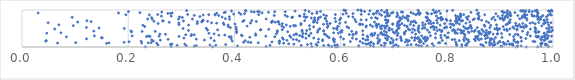
| Category | Series 0 |
|---|---|
| 0.949736153273273 | 0.001 |
| 0.9313688647821662 | 0.002 |
| 0.9712705436193924 | 0.003 |
| 0.3588209849443694 | 0.004 |
| 0.23239114258448637 | 0.005 |
| 0.6979563549919789 | 0.006 |
| 0.5908845298088734 | 0.007 |
| 0.5944280000425406 | 0.008 |
| 0.5458158395788048 | 0.009 |
| 0.9914450610635839 | 0.01 |
| 0.5836586960909029 | 0.011 |
| 0.45986314800716355 | 0.012 |
| 0.8279800813658241 | 0.013 |
| 0.2810581044408342 | 0.014 |
| 0.9037495786408707 | 0.015 |
| 0.6621071880290952 | 0.016 |
| 0.9017380704320929 | 0.017 |
| 0.9771379449883671 | 0.018 |
| 0.3244766761777045 | 0.019 |
| 0.7085061971466029 | 0.02 |
| 0.8693611338816062 | 0.021 |
| 0.6823229191553621 | 0.022 |
| 0.6343750244117963 | 0.023 |
| 0.752289813761984 | 0.024 |
| 0.5785647612633386 | 0.025 |
| 0.9333479806501159 | 0.026 |
| 0.40575277696712936 | 0.027 |
| 0.940079056336971 | 0.028 |
| 0.8866730989315225 | 0.029 |
| 0.6340983724571785 | 0.03 |
| 0.7629999644028119 | 0.031 |
| 0.7754784490591137 | 0.032 |
| 0.30938181607100584 | 0.033 |
| 0.8186320681349829 | 0.034 |
| 0.7473101029380873 | 0.035 |
| 0.656359696268609 | 0.036 |
| 0.32820519175504337 | 0.037 |
| 0.5683514183204914 | 0.038 |
| 0.7008387337262965 | 0.039 |
| 0.9247577547591842 | 0.04 |
| 0.5258753877711302 | 0.041 |
| 0.29210101245507425 | 0.042 |
| 0.4670330751344066 | 0.043 |
| 0.5555771647170828 | 0.044 |
| 0.8352700283421595 | 0.045 |
| 0.3649902197521072 | 0.046 |
| 0.6765020242880322 | 0.047 |
| 0.8371543506026319 | 0.048 |
| 0.8676884753774652 | 0.049 |
| 0.8885929144082504 | 0.05 |
| 0.5890490044521343 | 0.051 |
| 0.7259317878775712 | 0.052 |
| 0.5768857440754621 | 0.053 |
| 0.3539496398170522 | 0.054 |
| 0.8807512328298293 | 0.055 |
| 0.25612301864052595 | 0.056 |
| 0.9866158487966449 | 0.057 |
| 0.5939927365505132 | 0.058 |
| 0.7045521284816405 | 0.059 |
| 0.8281863738406184 | 0.06 |
| 0.9884989083171684 | 0.061 |
| 0.7423195374712963 | 0.062 |
| 0.6066458847214843 | 0.063 |
| 0.985812361390773 | 0.064 |
| 0.7327842786760105 | 0.065 |
| 0.5374900326658978 | 0.066 |
| 0.8639613701213325 | 0.067 |
| 0.3835848848063844 | 0.068 |
| 0.27951007807849054 | 0.069 |
| 0.8907281762333378 | 0.07 |
| 0.5538053393458792 | 0.071 |
| 0.917766506147673 | 0.072 |
| 0.9081760411610182 | 0.073 |
| 0.9219061372387005 | 0.074 |
| 0.8182794049310603 | 0.075 |
| 0.9118612669554279 | 0.076 |
| 0.5119764629002982 | 0.077 |
| 0.6501875104317437 | 0.078 |
| 0.3065782841964467 | 0.079 |
| 0.9239991143705089 | 0.08 |
| 0.9858427922235016 | 0.081 |
| 0.2822638099612795 | 0.082 |
| 0.6471207016883264 | 0.083 |
| 0.9190803499635846 | 0.084 |
| 0.66217789097223 | 0.085 |
| 0.5022041187656148 | 0.086 |
| 0.978468038221844 | 0.087 |
| 0.9768880618369399 | 0.088 |
| 0.5443231729552279 | 0.089 |
| 0.8848357560624478 | 0.09 |
| 0.772648782295962 | 0.091 |
| 0.6529821678158689 | 0.092 |
| 0.7976873493404779 | 0.093 |
| 0.7562446340762456 | 0.094 |
| 0.8383359343945119 | 0.095 |
| 0.9790123553002534 | 0.096 |
| 0.6845499453281203 | 0.097 |
| 0.1592231776711994 | 0.098 |
| 0.4848225671303291 | 0.099 |
| 0.6940567111540826 | 0.1 |
| 0.6700585967752053 | 0.101 |
| 0.682472685370516 | 0.102 |
| 0.49280154317735464 | 0.103 |
| 0.2536605195349129 | 0.104 |
| 0.8959998863830493 | 0.105 |
| 0.06695026888741842 | 0.106 |
| 0.22541302471217015 | 0.107 |
| 0.6417827139325417 | 0.108 |
| 0.9075689156809466 | 0.109 |
| 0.1636699229877255 | 0.11 |
| 0.7843776568012912 | 0.111 |
| 0.2375682598214314 | 0.112 |
| 0.9790495846816536 | 0.113 |
| 0.7867514310627184 | 0.114 |
| 0.4449310327876867 | 0.115 |
| 0.1012494146946395 | 0.116 |
| 0.24304977706323852 | 0.117 |
| 0.698302402181708 | 0.118 |
| 0.8802648275275994 | 0.119 |
| 0.9339849448006651 | 0.12 |
| 0.6562904279233956 | 0.121 |
| 0.4308411027652936 | 0.122 |
| 0.8738112972236661 | 0.123 |
| 0.7492831274123413 | 0.124 |
| 0.9062500026478404 | 0.125 |
| 0.19227697223732898 | 0.126 |
| 0.4172123249903969 | 0.127 |
| 0.9303400080414778 | 0.128 |
| 0.5577671635421152 | 0.129 |
| 0.8170494096755716 | 0.13 |
| 0.693753429745958 | 0.131 |
| 0.6577400059185562 | 0.132 |
| 0.4259444125202323 | 0.133 |
| 0.7216345568415801 | 0.134 |
| 0.5881933117077223 | 0.135 |
| 0.47071387933759407 | 0.136 |
| 0.8891983641320135 | 0.137 |
| 0.4843801109313892 | 0.138 |
| 0.672656058044507 | 0.139 |
| 0.9931026033241311 | 0.14 |
| 0.9334809937811736 | 0.141 |
| 0.20164617368321297 | 0.142 |
| 0.9000709987141736 | 0.143 |
| 0.9964849789441529 | 0.144 |
| 0.9658846879616302 | 0.145 |
| 0.8414901886177256 | 0.146 |
| 0.7268266202967334 | 0.147 |
| 0.6183668833177588 | 0.148 |
| 0.8993382788033822 | 0.149 |
| 0.6367539748515755 | 0.15 |
| 0.7516704542912436 | 0.151 |
| 0.9625233139497282 | 0.152 |
| 0.7479275214209876 | 0.153 |
| 0.915080031113293 | 0.154 |
| 0.22439569516465133 | 0.155 |
| 0.671142814637147 | 0.156 |
| 0.04474872431893427 | 0.157 |
| 0.940658684181506 | 0.158 |
| 0.24732758754629144 | 0.159 |
| 0.5218704800515306 | 0.16 |
| 0.3957906665276495 | 0.161 |
| 0.7602793425844558 | 0.162 |
| 0.8325978030409099 | 0.163 |
| 0.7598916547923797 | 0.164 |
| 0.7262602191975286 | 0.165 |
| 0.9263388202413942 | 0.166 |
| 0.48492543060013116 | 0.167 |
| 0.566236404878688 | 0.168 |
| 0.362159680913203 | 0.169 |
| 0.8819751099500956 | 0.17 |
| 0.4203122915348323 | 0.171 |
| 0.8538705820471038 | 0.172 |
| 0.04580103916682697 | 0.173 |
| 0.8235774408552178 | 0.174 |
| 0.7293688789007248 | 0.175 |
| 0.7144991605334121 | 0.176 |
| 0.7619010518990641 | 0.177 |
| 0.7914546290325968 | 0.178 |
| 0.7392585922854943 | 0.179 |
| 0.9831142649556573 | 0.18 |
| 0.498921338557431 | 0.181 |
| 0.699299244718949 | 0.182 |
| 0.7145820941070058 | 0.183 |
| 0.5867752319422623 | 0.184 |
| 0.2604842460809257 | 0.185 |
| 0.9849465291573857 | 0.186 |
| 0.6877905030072319 | 0.187 |
| 0.6473598874199733 | 0.188 |
| 0.34344898781602357 | 0.189 |
| 0.8607134893742396 | 0.19 |
| 0.8403673958814535 | 0.191 |
| 0.2442703678978854 | 0.192 |
| 0.6739722172991793 | 0.193 |
| 0.6514945642822935 | 0.194 |
| 0.5661974342023492 | 0.195 |
| 0.8886448175709949 | 0.196 |
| 0.7238777756649618 | 0.197 |
| 0.5170517334991199 | 0.198 |
| 0.5885266904468249 | 0.199 |
| 0.8102429765994911 | 0.2 |
| 0.7493686694638569 | 0.201 |
| 0.8317957142063499 | 0.202 |
| 0.8148552710021086 | 0.203 |
| 0.7055253077380912 | 0.204 |
| 0.9774397966361902 | 0.205 |
| 0.5106687529577528 | 0.206 |
| 0.27509605050119956 | 0.207 |
| 0.9267762545639725 | 0.208 |
| 0.49223632412893875 | 0.209 |
| 0.9783915834310928 | 0.21 |
| 0.8518501536317649 | 0.211 |
| 0.5584022505318609 | 0.212 |
| 0.3280564668490849 | 0.213 |
| 0.6297393290116114 | 0.214 |
| 0.8649891929577345 | 0.215 |
| 0.8372200613180846 | 0.216 |
| 0.6054705519399176 | 0.217 |
| 0.7578936047005799 | 0.218 |
| 0.6880390897672266 | 0.219 |
| 0.9769423878207975 | 0.22 |
| 0.12159712427574396 | 0.221 |
| 0.8818163389694909 | 0.222 |
| 0.8845822753485124 | 0.223 |
| 0.5861959774365494 | 0.224 |
| 0.6422146295399044 | 0.225 |
| 0.8729079188647741 | 0.226 |
| 0.3939630254656727 | 0.227 |
| 0.8586083559122829 | 0.228 |
| 0.74457945777082 | 0.229 |
| 0.7640960939778023 | 0.23 |
| 0.9487389284740991 | 0.231 |
| 0.9901857590406791 | 0.232 |
| 0.695789214664223 | 0.233 |
| 0.987231593819244 | 0.234 |
| 0.7135097590127075 | 0.235 |
| 0.756119205114753 | 0.236 |
| 0.669584421678318 | 0.237 |
| 0.5347133223116146 | 0.238 |
| 0.6222522960840166 | 0.239 |
| 0.684758603349414 | 0.24 |
| 0.30487932013933405 | 0.241 |
| 0.7410954249087052 | 0.242 |
| 0.549427497078257 | 0.243 |
| 0.3555727832171321 | 0.244 |
| 0.8554373569205245 | 0.245 |
| 0.7787926522057627 | 0.246 |
| 0.4903398395231873 | 0.247 |
| 0.15105213428753778 | 0.248 |
| 0.1498193826702934 | 0.249 |
| 0.7397201835165316 | 0.25 |
| 0.7892423911970925 | 0.251 |
| 0.7629587723561766 | 0.252 |
| 0.734015665112782 | 0.253 |
| 0.578399111266711 | 0.254 |
| 0.8000271531865475 | 0.255 |
| 0.8918781919148691 | 0.256 |
| 0.9395453298373049 | 0.257 |
| 0.8770119592824627 | 0.258 |
| 0.9038768602714761 | 0.259 |
| 0.8024695519701306 | 0.26 |
| 0.9395621959039823 | 0.261 |
| 0.7464734636517886 | 0.262 |
| 0.42900746480915536 | 0.263 |
| 0.9703708398207787 | 0.264 |
| 0.5060809500440735 | 0.265 |
| 0.6512225830611781 | 0.266 |
| 0.6001917859001028 | 0.267 |
| 0.8334444775341475 | 0.268 |
| 0.9845340853202271 | 0.269 |
| 0.7590653274319367 | 0.27 |
| 0.5287166458748227 | 0.271 |
| 0.7130276949989909 | 0.272 |
| 0.6903313416420871 | 0.273 |
| 0.08380760933258947 | 0.274 |
| 0.98349018359313 | 0.275 |
| 0.3902278814380645 | 0.276 |
| 0.3939598648799294 | 0.277 |
| 0.47607237178507206 | 0.278 |
| 0.9791313269609966 | 0.279 |
| 0.9832362532175686 | 0.28 |
| 0.23440012484631564 | 0.281 |
| 0.9728415241297717 | 0.282 |
| 0.9257016144196557 | 0.283 |
| 0.9718781961729461 | 0.284 |
| 0.8544060633845529 | 0.285 |
| 0.24119326644251804 | 0.286 |
| 0.5751765981438353 | 0.287 |
| 0.29577518146172116 | 0.288 |
| 0.8585312801554182 | 0.289 |
| 0.258215693222239 | 0.29 |
| 0.4592113471919155 | 0.291 |
| 0.9972517624711268 | 0.292 |
| 0.9678350641466538 | 0.293 |
| 0.5270839692934521 | 0.294 |
| 0.6501481401492059 | 0.295 |
| 0.23754934097980474 | 0.296 |
| 0.9573410623982214 | 0.297 |
| 0.5406662779008898 | 0.298 |
| 0.20742395201355068 | 0.299 |
| 0.9911479767731145 | 0.3 |
| 0.13637682292092432 | 0.301 |
| 0.7525773753590337 | 0.302 |
| 0.7691157575700802 | 0.303 |
| 0.5042887681416929 | 0.304 |
| 0.4145283503692526 | 0.305 |
| 0.31858928353055815 | 0.306 |
| 0.6597560397441731 | 0.307 |
| 0.8714120958918081 | 0.308 |
| 0.5404021488379139 | 0.309 |
| 0.522727273362455 | 0.31 |
| 0.7067349363233189 | 0.311 |
| 0.7960652125088354 | 0.312 |
| 0.6872186241805361 | 0.313 |
| 0.7885887919519117 | 0.314 |
| 0.6707132771678361 | 0.315 |
| 0.8723939037135764 | 0.316 |
| 0.4401071981937938 | 0.317 |
| 0.37090632620111724 | 0.318 |
| 0.41322379821648675 | 0.319 |
| 0.6230483945171781 | 0.32 |
| 0.9344081566586451 | 0.321 |
| 0.3818020453494264 | 0.322 |
| 0.8752619083720993 | 0.323 |
| 0.683333730246154 | 0.324 |
| 0.9876437178734299 | 0.325 |
| 0.6629286389877335 | 0.326 |
| 0.5122272493898425 | 0.327 |
| 0.6569961262487748 | 0.328 |
| 0.32429644221373316 | 0.329 |
| 0.5719002165438201 | 0.33 |
| 0.6420873276816561 | 0.331 |
| 0.30827371719595376 | 0.332 |
| 0.8342930255895888 | 0.333 |
| 0.31926146158748536 | 0.334 |
| 0.6790029973741445 | 0.335 |
| 0.9514776950190215 | 0.336 |
| 0.6164841685664055 | 0.337 |
| 0.9184744335736394 | 0.338 |
| 0.6816237691898679 | 0.339 |
| 0.5167970817778663 | 0.34 |
| 0.9334603663015866 | 0.341 |
| 0.6235165288404018 | 0.342 |
| 0.27018231752232086 | 0.343 |
| 0.9290673665769381 | 0.344 |
| 0.865385326733688 | 0.345 |
| 0.7411691219412792 | 0.346 |
| 0.8951106404603054 | 0.347 |
| 0.8874266580118054 | 0.348 |
| 0.25967256228372576 | 0.349 |
| 0.5693292066929116 | 0.35 |
| 0.7203630369168126 | 0.351 |
| 0.43990069952642613 | 0.352 |
| 0.8324043791506209 | 0.353 |
| 0.8615700006073396 | 0.354 |
| 0.36183131537204966 | 0.355 |
| 0.8791095119764558 | 0.356 |
| 0.47913020695763103 | 0.357 |
| 0.5161707847233024 | 0.358 |
| 0.6288384584422986 | 0.359 |
| 0.5347609227072416 | 0.36 |
| 0.6585943770651436 | 0.361 |
| 0.7788679316274892 | 0.362 |
| 0.5291328818887975 | 0.363 |
| 0.9029908977691488 | 0.364 |
| 0.8955953691583228 | 0.365 |
| 0.708241123188961 | 0.366 |
| 0.9837811052459587 | 0.367 |
| 0.6754252775363595 | 0.368 |
| 0.35195414399547165 | 0.369 |
| 0.9833251138143538 | 0.37 |
| 0.819553066608549 | 0.371 |
| 0.5441118226862806 | 0.372 |
| 0.046719010376525885 | 0.373 |
| 0.5956237487214753 | 0.374 |
| 0.7021819995326729 | 0.375 |
| 0.6645852374154868 | 0.376 |
| 0.8620328189342263 | 0.377 |
| 0.873177722447321 | 0.378 |
| 0.8265228635345201 | 0.379 |
| 0.8163281642995432 | 0.38 |
| 0.8154538468694112 | 0.381 |
| 0.8028655885818576 | 0.382 |
| 0.07327926683581049 | 0.383 |
| 0.5868993373422553 | 0.384 |
| 0.7196761037717094 | 0.385 |
| 0.9676240103140007 | 0.386 |
| 0.4040732522912125 | 0.387 |
| 0.841836675337895 | 0.388 |
| 0.8795174869727564 | 0.389 |
| 0.8292642761254063 | 0.39 |
| 0.6767482763596528 | 0.391 |
| 0.9526086815301121 | 0.392 |
| 0.8807040076898388 | 0.393 |
| 0.8781903514696698 | 0.394 |
| 0.7348192310425262 | 0.395 |
| 0.7670204096352549 | 0.396 |
| 0.6862182296209829 | 0.397 |
| 0.7479854895234903 | 0.398 |
| 0.6297294148410298 | 0.399 |
| 0.9724881673305967 | 0.4 |
| 0.6019738159910182 | 0.401 |
| 0.5564811374923992 | 0.402 |
| 0.9896217750007635 | 0.403 |
| 0.8816675701480112 | 0.404 |
| 0.6990959026925694 | 0.405 |
| 0.8403372670366838 | 0.406 |
| 0.5998999803159059 | 0.407 |
| 0.9923515071693668 | 0.408 |
| 0.48094811634544554 | 0.409 |
| 0.20630684779993885 | 0.41 |
| 0.8596195908112508 | 0.411 |
| 0.5003086331362187 | 0.412 |
| 0.9963142755271943 | 0.413 |
| 0.790044012505673 | 0.414 |
| 0.9730712661112635 | 0.415 |
| 0.8689348709326415 | 0.416 |
| 0.9911380911270377 | 0.417 |
| 0.7051960337436747 | 0.418 |
| 0.851811795485328 | 0.419 |
| 0.22619858735972484 | 0.42 |
| 0.5274921248186157 | 0.421 |
| 0.25082556056095906 | 0.422 |
| 0.8606461950370319 | 0.423 |
| 0.9662056244671069 | 0.424 |
| 0.6209403652637582 | 0.425 |
| 0.7226592230583945 | 0.426 |
| 0.4041778064344766 | 0.427 |
| 0.9425620904135059 | 0.428 |
| 0.847088454963712 | 0.429 |
| 0.13525030396704982 | 0.43 |
| 0.6823275120664627 | 0.431 |
| 0.8282897136893496 | 0.432 |
| 0.816002163124775 | 0.433 |
| 0.5680027899301079 | 0.434 |
| 0.20507707814044018 | 0.435 |
| 0.8319818241225692 | 0.436 |
| 0.6416428946154127 | 0.437 |
| 0.48066203337171 | 0.438 |
| 0.9136666467729392 | 0.439 |
| 0.5683060236917177 | 0.44 |
| 0.781767862913001 | 0.441 |
| 0.5360599949016707 | 0.442 |
| 0.7054668058654607 | 0.443 |
| 0.7909900927217042 | 0.444 |
| 0.8107609178984982 | 0.445 |
| 0.6028259139735676 | 0.446 |
| 0.7459325812878126 | 0.447 |
| 0.3135687990945447 | 0.448 |
| 0.8744851795916995 | 0.449 |
| 0.6913986402848691 | 0.45 |
| 0.9991544956520481 | 0.451 |
| 0.7396732091341026 | 0.452 |
| 0.5274929912824536 | 0.453 |
| 0.8957955834619686 | 0.454 |
| 0.8534982129520801 | 0.455 |
| 0.5576227335413411 | 0.456 |
| 0.3493510658598865 | 0.457 |
| 0.8257632390895437 | 0.458 |
| 0.7634205760351626 | 0.459 |
| 0.9319339554313751 | 0.46 |
| 0.8128958055122034 | 0.461 |
| 0.4488938431453584 | 0.462 |
| 0.36840866061240074 | 0.463 |
| 0.7862889291045403 | 0.464 |
| 0.7303875907417288 | 0.465 |
| 0.4499218020994862 | 0.466 |
| 0.9083613303640506 | 0.467 |
| 0.4900312251109884 | 0.468 |
| 0.6912866421488981 | 0.469 |
| 0.8127231130173086 | 0.47 |
| 0.9677024689777338 | 0.471 |
| 0.8661077838578768 | 0.472 |
| 0.7758860987404084 | 0.473 |
| 0.9128760510274648 | 0.474 |
| 0.5935582688226549 | 0.475 |
| 0.6967528048711696 | 0.476 |
| 0.8212093310868145 | 0.477 |
| 0.4645814387157979 | 0.478 |
| 0.7278796217964013 | 0.479 |
| 0.9326723956148432 | 0.48 |
| 0.9928368192178487 | 0.481 |
| 0.5418924355252774 | 0.482 |
| 0.9573648493605393 | 0.483 |
| 0.06160073620787866 | 0.484 |
| 0.4034921457661796 | 0.485 |
| 0.8903068258333888 | 0.486 |
| 0.8956565171683911 | 0.487 |
| 0.7360060277797151 | 0.488 |
| 0.6761880129384821 | 0.489 |
| 0.918805697302855 | 0.49 |
| 0.8996419063600115 | 0.491 |
| 0.8949491935863755 | 0.492 |
| 0.5607390187268749 | 0.493 |
| 0.8374791575221667 | 0.494 |
| 0.7081272972422863 | 0.495 |
| 0.6765586048792585 | 0.496 |
| 0.7463963576505698 | 0.497 |
| 0.753954444260029 | 0.498 |
| 0.30333567320229404 | 0.499 |
| 0.5919511792677228 | 0.5 |
| 0.19275441188859732 | 0.501 |
| 0.5868139496974304 | 0.502 |
| 0.9267822924204737 | 0.503 |
| 0.9881974447493758 | 0.504 |
| 0.8402203340052686 | 0.505 |
| 0.8350339973510629 | 0.506 |
| 0.34709662217969944 | 0.507 |
| 0.8466258155192389 | 0.508 |
| 0.7587115489695455 | 0.509 |
| 0.6836080726170605 | 0.51 |
| 0.6917226942120611 | 0.511 |
| 0.1450496127335579 | 0.512 |
| 0.6843908180045141 | 0.513 |
| 0.7464074136266184 | 0.514 |
| 0.795504456835019 | 0.515 |
| 0.6152488685180255 | 0.516 |
| 0.966038285759236 | 0.517 |
| 0.8941986938202786 | 0.518 |
| 0.9664962389606396 | 0.519 |
| 0.7102863463835204 | 0.52 |
| 0.8810274237506186 | 0.521 |
| 0.3924039851757955 | 0.522 |
| 0.9458850967926387 | 0.523 |
| 0.8574514477945772 | 0.524 |
| 0.7576387118154118 | 0.525 |
| 0.7803384834710998 | 0.526 |
| 0.12129213358000977 | 0.527 |
| 0.9976790647654159 | 0.528 |
| 0.5750347147410475 | 0.529 |
| 0.807074238043271 | 0.53 |
| 0.7701065692710785 | 0.531 |
| 0.49297157492432514 | 0.532 |
| 0.8433480493310275 | 0.533 |
| 0.7979959302075538 | 0.534 |
| 0.6681770773427121 | 0.535 |
| 0.7997289041456671 | 0.536 |
| 0.993409579800807 | 0.537 |
| 0.7766617574420203 | 0.538 |
| 0.403240626892841 | 0.539 |
| 0.6479131967832729 | 0.54 |
| 0.9243565004068989 | 0.541 |
| 0.7253481760403265 | 0.542 |
| 0.5491740418781474 | 0.543 |
| 0.9410228792625893 | 0.544 |
| 0.9437095743600463 | 0.545 |
| 0.9391421082340915 | 0.546 |
| 0.6121319652947448 | 0.547 |
| 0.7729275169996059 | 0.548 |
| 0.9060709855132478 | 0.549 |
| 0.6749641628543169 | 0.55 |
| 0.3883669524913001 | 0.551 |
| 0.2310940833026815 | 0.552 |
| 0.6602278433555497 | 0.553 |
| 0.77383145024865 | 0.554 |
| 0.8315688389879093 | 0.555 |
| 0.9501947397374326 | 0.556 |
| 0.505154586337027 | 0.557 |
| 0.5952213965915294 | 0.558 |
| 0.8716772816678725 | 0.559 |
| 0.5948659329247868 | 0.56 |
| 0.9336752277386461 | 0.561 |
| 0.7253071533278198 | 0.562 |
| 0.6824314987624243 | 0.563 |
| 0.42391346178486305 | 0.564 |
| 0.4891998308981107 | 0.565 |
| 0.6870698018309337 | 0.566 |
| 0.7065651527801198 | 0.567 |
| 0.747077742080532 | 0.568 |
| 0.6485543547835286 | 0.569 |
| 0.9788680144700445 | 0.57 |
| 0.5132093818812665 | 0.571 |
| 0.8454136790461408 | 0.572 |
| 0.5764261694771657 | 0.573 |
| 0.5152996062281493 | 0.574 |
| 0.6876003413902418 | 0.575 |
| 0.6783339323874633 | 0.576 |
| 0.5414155278569956 | 0.577 |
| 0.09652407731532149 | 0.578 |
| 0.9299373997084789 | 0.579 |
| 0.7377000827087067 | 0.58 |
| 0.8444459386987189 | 0.581 |
| 0.5116515326549879 | 0.582 |
| 0.7204398561893918 | 0.583 |
| 0.6670541055561839 | 0.584 |
| 0.7546604128462632 | 0.585 |
| 0.8826467525631645 | 0.586 |
| 0.7106122791051427 | 0.587 |
| 0.81334141084183 | 0.588 |
| 0.22767940692433608 | 0.589 |
| 0.9484145851084734 | 0.59 |
| 0.7874056711191765 | 0.591 |
| 0.3137201431374121 | 0.592 |
| 0.8705208235804281 | 0.593 |
| 0.38824585103729065 | 0.594 |
| 0.6558919265300422 | 0.595 |
| 0.893643483355797 | 0.596 |
| 0.4977603059440009 | 0.597 |
| 0.7112451952798771 | 0.598 |
| 0.06948425136737492 | 0.599 |
| 0.6686105201382677 | 0.6 |
| 0.9917055563426216 | 0.601 |
| 0.5253516202005833 | 0.602 |
| 0.9115690431689247 | 0.603 |
| 0.6369516932365179 | 0.604 |
| 0.2956487881457643 | 0.605 |
| 0.9364313048689871 | 0.606 |
| 0.38029496686162656 | 0.607 |
| 0.8101076072053176 | 0.608 |
| 0.6415383990697254 | 0.609 |
| 0.7593544266713779 | 0.61 |
| 0.7312459228392667 | 0.611 |
| 0.6674410730576612 | 0.612 |
| 0.6717683717706818 | 0.613 |
| 0.5678704578021798 | 0.614 |
| 0.6983286929855532 | 0.615 |
| 0.6354867918565994 | 0.616 |
| 0.48463143797633607 | 0.617 |
| 0.8112299714098022 | 0.618 |
| 0.8238294905929852 | 0.619 |
| 0.9141987590073692 | 0.62 |
| 0.40109140050810943 | 0.621 |
| 0.6371681242423263 | 0.622 |
| 0.8063772797105943 | 0.623 |
| 0.6980833265003747 | 0.624 |
| 0.5748128949099378 | 0.625 |
| 0.7069842651201727 | 0.626 |
| 0.9664153504713676 | 0.627 |
| 0.7703542671180182 | 0.628 |
| 0.9825396231009622 | 0.629 |
| 0.9831263971507839 | 0.63 |
| 0.490343726158234 | 0.631 |
| 0.7154843844529947 | 0.632 |
| 0.330117193203517 | 0.633 |
| 0.7959274972847363 | 0.634 |
| 0.256348313704727 | 0.635 |
| 0.5253665603439281 | 0.636 |
| 0.9430530087719895 | 0.637 |
| 0.5801850709517368 | 0.638 |
| 0.7660511021130837 | 0.639 |
| 0.5983373089303916 | 0.64 |
| 0.929656462533474 | 0.641 |
| 0.817603413488029 | 0.642 |
| 0.8361050846161003 | 0.643 |
| 0.9568305053064116 | 0.644 |
| 0.3664845564395787 | 0.645 |
| 0.6863086369875965 | 0.646 |
| 0.3792164905137023 | 0.647 |
| 0.4303474024079671 | 0.648 |
| 0.7749810859805079 | 0.649 |
| 0.29539874278659867 | 0.65 |
| 0.7822333366549311 | 0.651 |
| 0.9171159117354712 | 0.652 |
| 0.35701521488346244 | 0.653 |
| 0.049189808791908644 | 0.654 |
| 0.7418683134270023 | 0.655 |
| 0.7545479278719086 | 0.656 |
| 0.9961851892978989 | 0.657 |
| 0.8788926681209509 | 0.658 |
| 0.9617991516138644 | 0.659 |
| 0.9858784140233782 | 0.66 |
| 0.555782544795506 | 0.661 |
| 0.9188339908812763 | 0.662 |
| 0.9730176898640499 | 0.663 |
| 0.8195835302238316 | 0.664 |
| 0.6093046434715867 | 0.665 |
| 0.4703307493500454 | 0.666 |
| 0.27716537099866395 | 0.667 |
| 0.548940373453371 | 0.668 |
| 0.9897867869066912 | 0.669 |
| 0.4768595151839105 | 0.67 |
| 0.4697113845244734 | 0.671 |
| 0.7078269067045604 | 0.672 |
| 0.9169557001905639 | 0.673 |
| 0.10479112142289079 | 0.674 |
| 0.6637651691413352 | 0.675 |
| 0.6879048944835441 | 0.676 |
| 0.7330633273361944 | 0.677 |
| 0.8431536569509717 | 0.678 |
| 0.7338295225656558 | 0.679 |
| 0.33840042487604066 | 0.68 |
| 0.48320312764772444 | 0.681 |
| 0.48179793981626107 | 0.682 |
| 0.6887407161099657 | 0.683 |
| 0.6289634199143065 | 0.684 |
| 0.33022968222874766 | 0.685 |
| 0.1300937765302595 | 0.686 |
| 0.5908315866915679 | 0.687 |
| 0.7097770641820625 | 0.688 |
| 0.4159022678719134 | 0.689 |
| 0.4413032955437363 | 0.69 |
| 0.7379039708069212 | 0.691 |
| 0.24858723600330793 | 0.692 |
| 0.8745631124377341 | 0.693 |
| 0.3495406541615587 | 0.694 |
| 0.551018004701559 | 0.695 |
| 0.7690133522825344 | 0.696 |
| 0.5738873264405255 | 0.697 |
| 0.8164588708363798 | 0.698 |
| 0.7393051422222479 | 0.699 |
| 0.4717559851369313 | 0.7 |
| 0.3402042342273964 | 0.701 |
| 0.7624328092107442 | 0.702 |
| 0.8282782396453041 | 0.703 |
| 0.30405154747600577 | 0.704 |
| 0.2647556438859194 | 0.705 |
| 0.26598744922567874 | 0.706 |
| 0.7109449517793898 | 0.707 |
| 0.5494545890789597 | 0.708 |
| 0.7272544176052758 | 0.709 |
| 0.12226135767095077 | 0.71 |
| 0.8265646994718738 | 0.711 |
| 0.8070036692266696 | 0.712 |
| 0.8299857923194718 | 0.713 |
| 0.5324373904963889 | 0.714 |
| 0.4326657081904688 | 0.715 |
| 0.4180321685177408 | 0.716 |
| 0.9833787804139517 | 0.717 |
| 0.340971822767351 | 0.718 |
| 0.7808308842697906 | 0.719 |
| 0.8001838720240477 | 0.72 |
| 0.6892555077112463 | 0.721 |
| 0.8183509006427174 | 0.722 |
| 0.8175529754970924 | 0.723 |
| 0.9068889745934213 | 0.724 |
| 0.8654742047954056 | 0.725 |
| 0.9834115980494353 | 0.726 |
| 0.789339532559917 | 0.727 |
| 0.9511140996908237 | 0.728 |
| 0.340784846065386 | 0.729 |
| 0.8911811573452934 | 0.73 |
| 0.6840308165016695 | 0.731 |
| 0.822586649002529 | 0.732 |
| 0.6484675729193633 | 0.733 |
| 0.5981971835167439 | 0.734 |
| 0.6386231811685058 | 0.735 |
| 0.6853981566292098 | 0.736 |
| 0.7655329899484165 | 0.737 |
| 0.9195093122690735 | 0.738 |
| 0.8496480472007186 | 0.739 |
| 0.5573240380794928 | 0.74 |
| 0.551001532943305 | 0.741 |
| 0.9064264203691437 | 0.742 |
| 0.9753212976763742 | 0.743 |
| 0.9889232721376118 | 0.744 |
| 0.7265846591146026 | 0.745 |
| 0.6268862761822528 | 0.746 |
| 0.8391959872082343 | 0.747 |
| 0.9713506106188113 | 0.748 |
| 0.7987662725396667 | 0.749 |
| 0.3909022364923907 | 0.75 |
| 0.24531192850482084 | 0.751 |
| 0.8600255943805953 | 0.752 |
| 0.9765181488076191 | 0.753 |
| 0.29476934870918503 | 0.754 |
| 0.7922694763685026 | 0.755 |
| 0.3209179746552112 | 0.756 |
| 0.23662955260497331 | 0.757 |
| 0.4598445693620255 | 0.758 |
| 0.8847698738535756 | 0.759 |
| 0.8519422541893179 | 0.76 |
| 0.9373339242413895 | 0.761 |
| 0.5712992721790969 | 0.762 |
| 0.7146766770098556 | 0.763 |
| 0.7128663716402966 | 0.764 |
| 0.9010881020791724 | 0.765 |
| 0.38300879128397813 | 0.766 |
| 0.9089639796455249 | 0.767 |
| 0.6691339756343794 | 0.768 |
| 0.823423564911103 | 0.769 |
| 0.5715675018169893 | 0.77 |
| 0.9503368079835383 | 0.771 |
| 0.9003956787183196 | 0.772 |
| 0.7126527486313242 | 0.773 |
| 0.8594575187980112 | 0.774 |
| 0.5895164321036519 | 0.775 |
| 0.8594883095805975 | 0.776 |
| 0.5709945184205044 | 0.777 |
| 0.7836656170340934 | 0.778 |
| 0.6002381886673082 | 0.779 |
| 0.7897776398390797 | 0.78 |
| 0.7886371983648018 | 0.781 |
| 0.8179476708068553 | 0.782 |
| 0.5446976780713716 | 0.783 |
| 0.788158873432916 | 0.784 |
| 0.9042150810685974 | 0.785 |
| 0.6580405048528765 | 0.786 |
| 0.7210227027720457 | 0.787 |
| 0.558425407097396 | 0.788 |
| 0.5511200660576344 | 0.789 |
| 0.9414540491721078 | 0.79 |
| 0.7236056124386487 | 0.791 |
| 0.7631178942911931 | 0.792 |
| 0.24405651562192596 | 0.793 |
| 0.6659499476257124 | 0.794 |
| 0.7112873596904953 | 0.795 |
| 0.8368352871010076 | 0.796 |
| 0.9469826052334108 | 0.797 |
| 0.5079832144266015 | 0.798 |
| 0.30195192120635345 | 0.799 |
| 0.5346960084281958 | 0.8 |
| 0.7623833669974943 | 0.801 |
| 0.7894943074269558 | 0.802 |
| 0.9732430580138972 | 0.803 |
| 0.09454027035270238 | 0.804 |
| 0.9149006939468732 | 0.805 |
| 0.8880797763230739 | 0.806 |
| 0.5096590840179455 | 0.807 |
| 0.7608321731428979 | 0.808 |
| 0.376898689519058 | 0.809 |
| 0.8258339614619545 | 0.81 |
| 0.5620791942422593 | 0.811 |
| 0.6231559797083548 | 0.812 |
| 0.2965312583656894 | 0.813 |
| 0.9782561675671974 | 0.814 |
| 0.536570116682791 | 0.815 |
| 0.9876791618391787 | 0.816 |
| 0.3905728011807212 | 0.817 |
| 0.6843592688590238 | 0.818 |
| 0.9098024535046223 | 0.819 |
| 0.7057903129516948 | 0.82 |
| 0.5313543912487865 | 0.821 |
| 0.8206447386035636 | 0.822 |
| 0.335078093150152 | 0.823 |
| 0.49979312282776206 | 0.824 |
| 0.945826846589783 | 0.825 |
| 0.6148875240035236 | 0.826 |
| 0.7174247701612178 | 0.827 |
| 0.8408834413451672 | 0.828 |
| 0.9693128604908797 | 0.829 |
| 0.8963367207884948 | 0.83 |
| 0.7283463851322141 | 0.831 |
| 0.8610694805913334 | 0.832 |
| 0.281005424049911 | 0.833 |
| 0.2627008213083717 | 0.834 |
| 0.9426319372377896 | 0.835 |
| 0.9645938361735414 | 0.836 |
| 0.9612337321755539 | 0.837 |
| 0.5236023152079786 | 0.838 |
| 0.7804903278219952 | 0.839 |
| 0.5224669094133599 | 0.84 |
| 0.7255706884515256 | 0.841 |
| 0.6897800313860073 | 0.842 |
| 0.9125926261605373 | 0.843 |
| 0.5733273384453489 | 0.844 |
| 0.9205611961447752 | 0.845 |
| 0.692053788342134 | 0.846 |
| 0.8267721963653838 | 0.847 |
| 0.8163481929963347 | 0.848 |
| 0.9336656611851838 | 0.849 |
| 0.9809776878164302 | 0.85 |
| 0.3703692572291331 | 0.851 |
| 0.4751593383625302 | 0.852 |
| 0.9704346518614176 | 0.853 |
| 0.9047942515568457 | 0.854 |
| 0.32434374436698526 | 0.855 |
| 0.49557595657322245 | 0.856 |
| 0.6771417303245177 | 0.857 |
| 0.6876370484833051 | 0.858 |
| 0.9909715520079759 | 0.859 |
| 0.9474139453060736 | 0.86 |
| 0.9192219251325322 | 0.861 |
| 0.8256750251423207 | 0.862 |
| 0.7074660131702587 | 0.863 |
| 0.9968733086996663 | 0.864 |
| 0.3411517385002803 | 0.865 |
| 0.36372635290015765 | 0.866 |
| 0.23980851839779155 | 0.867 |
| 0.9505850506359654 | 0.868 |
| 0.5682165960106246 | 0.869 |
| 0.19553300892373104 | 0.87 |
| 0.8713276852004336 | 0.871 |
| 0.7416447770153327 | 0.872 |
| 0.35169798679065767 | 0.873 |
| 0.9602416925598697 | 0.874 |
| 0.4457385766862337 | 0.875 |
| 0.831936058839398 | 0.876 |
| 0.5901314299898469 | 0.877 |
| 0.2555382513136064 | 0.878 |
| 0.748325372896515 | 0.879 |
| 0.3120663156818366 | 0.88 |
| 0.6389389114326318 | 0.881 |
| 0.9460648156887497 | 0.882 |
| 0.9153175357192995 | 0.883 |
| 0.4121776553607011 | 0.884 |
| 0.3639469107758248 | 0.885 |
| 0.9946162736221243 | 0.886 |
| 0.604542451131971 | 0.887 |
| 0.6532112973930357 | 0.888 |
| 0.39867999685541333 | 0.889 |
| 0.8578974879244854 | 0.89 |
| 0.9197485482746007 | 0.891 |
| 0.5317434134087731 | 0.892 |
| 0.7645508901943233 | 0.893 |
| 0.6622005001962175 | 0.894 |
| 0.8256300161752274 | 0.895 |
| 0.6617056653371596 | 0.896 |
| 0.7711498134474678 | 0.897 |
| 0.6731512646795317 | 0.898 |
| 0.7449112282155773 | 0.899 |
| 0.41895113011460894 | 0.9 |
| 0.8923390157770663 | 0.901 |
| 0.6232439982609684 | 0.902 |
| 0.5462743602029716 | 0.903 |
| 0.7370376512218181 | 0.904 |
| 0.9719709680287919 | 0.905 |
| 0.7880102845534124 | 0.906 |
| 0.2796274524464706 | 0.907 |
| 0.6108231659902857 | 0.908 |
| 0.27470818867934343 | 0.909 |
| 0.7497241423438642 | 0.91 |
| 0.6888226750039645 | 0.911 |
| 0.36687792615367976 | 0.912 |
| 0.5551800906486446 | 0.913 |
| 0.7487141434037157 | 0.914 |
| 0.6669457889041508 | 0.915 |
| 0.6957537000159716 | 0.916 |
| 0.8598333963072349 | 0.917 |
| 0.7492230975198059 | 0.918 |
| 0.030375665679661153 | 0.919 |
| 0.18180840254693378 | 0.92 |
| 0.7064350871416621 | 0.921 |
| 0.2828226831675565 | 0.922 |
| 0.4521459986997369 | 0.923 |
| 0.9072137104171203 | 0.924 |
| 0.4089754623702211 | 0.925 |
| 0.7623252190285137 | 0.926 |
| 0.7765855066203412 | 0.927 |
| 0.22204615205943443 | 0.928 |
| 0.38072781838775577 | 0.929 |
| 0.928177633842735 | 0.93 |
| 0.9123653032470453 | 0.931 |
| 0.7325176053490932 | 0.932 |
| 0.7803541986121265 | 0.933 |
| 0.6985915380648174 | 0.934 |
| 0.9187627363971138 | 0.935 |
| 0.8455691967608607 | 0.936 |
| 0.46416946183413854 | 0.937 |
| 0.7477735354694426 | 0.938 |
| 0.6825495326961782 | 0.939 |
| 0.6871180673057834 | 0.94 |
| 0.7168744097974018 | 0.941 |
| 0.9699824783870762 | 0.942 |
| 0.3829616197988337 | 0.943 |
| 0.2631868567177092 | 0.944 |
| 0.4374014079942196 | 0.945 |
| 0.9472206275896636 | 0.946 |
| 0.9069966006109407 | 0.947 |
| 0.7145226063918889 | 0.948 |
| 0.555539221482295 | 0.949 |
| 0.9550099060614846 | 0.95 |
| 0.9712444194846966 | 0.951 |
| 0.4956304247699559 | 0.952 |
| 0.4469112869263197 | 0.953 |
| 0.47585631890301744 | 0.954 |
| 0.4321603232560574 | 0.955 |
| 0.9609283446116733 | 0.956 |
| 0.20043291781368497 | 0.957 |
| 0.540398940088106 | 0.958 |
| 0.7797795433717423 | 0.959 |
| 0.44383090199459063 | 0.96 |
| 0.6453124928079399 | 0.961 |
| 0.5621812553532217 | 0.962 |
| 0.9420567629282465 | 0.963 |
| 0.9037393332597583 | 0.964 |
| 0.992896230603475 | 0.965 |
| 0.9947274224124815 | 0.966 |
| 0.6689924380317731 | 0.967 |
| 0.669861068010416 | 0.968 |
| 0.42175916504072236 | 0.969 |
| 0.5143038392685368 | 0.97 |
| 0.3945989372360715 | 0.971 |
| 0.9981496183977527 | 0.972 |
| 0.7853965434741997 | 0.973 |
| 0.6392007408606525 | 0.974 |
| 0.8004081894777152 | 0.975 |
| 0.9956016614798532 | 0.976 |
| 0.9914057116046482 | 0.977 |
| 0.914475244543429 | 0.978 |
| 0.9660896639916852 | 0.979 |
| 0.6552209205298176 | 0.98 |
| 0.9391687474287802 | 0.981 |
| 0.9484441422545509 | 0.982 |
| 0.9550156680825107 | 0.983 |
| 0.3099641114736035 | 0.984 |
| 0.6094805267666722 | 0.985 |
| 0.943455311843807 | 0.986 |
| 0.4209364226889935 | 0.987 |
| 0.677091339801591 | 0.988 |
| 0.8110896346973073 | 0.989 |
| 0.5332168562389419 | 0.99 |
| 0.6077527041873076 | 0.991 |
| 0.9971653691103013 | 0.992 |
| 0.6871201782498929 | 0.993 |
| 0.7458808702935992 | 0.994 |
| 0.8564746217503482 | 0.995 |
| 0.6061153624370342 | 0.996 |
| 0.6378926415943542 | 0.997 |
| 0.6323117081767147 | 0.998 |
| 0.9697406849690962 | 0.999 |
| 0.7744447679722846 | 1 |